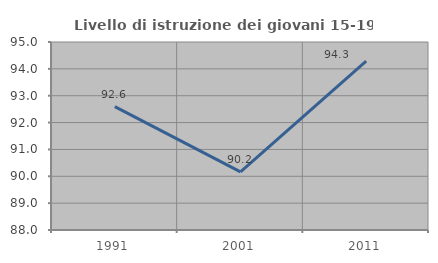
| Category | Livello di istruzione dei giovani 15-19 anni |
|---|---|
| 1991.0 | 92.593 |
| 2001.0 | 90.164 |
| 2011.0 | 94.286 |